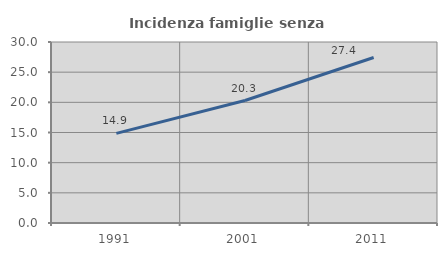
| Category | Incidenza famiglie senza nuclei |
|---|---|
| 1991.0 | 14.858 |
| 2001.0 | 20.302 |
| 2011.0 | 27.433 |